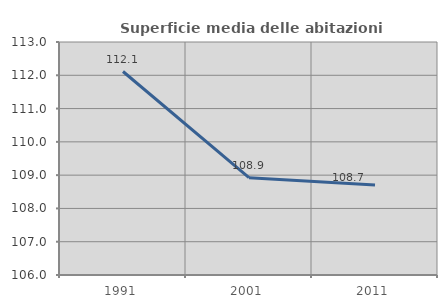
| Category | Superficie media delle abitazioni occupate |
|---|---|
| 1991.0 | 112.113 |
| 2001.0 | 108.923 |
| 2011.0 | 108.703 |